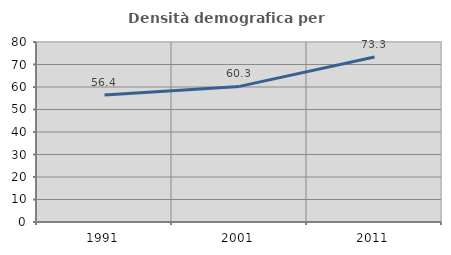
| Category | Densità demografica |
|---|---|
| 1991.0 | 56.427 |
| 2001.0 | 60.266 |
| 2011.0 | 73.299 |